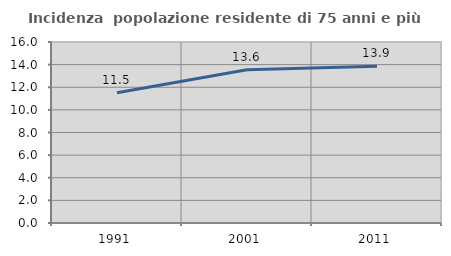
| Category | Incidenza  popolazione residente di 75 anni e più |
|---|---|
| 1991.0 | 11.518 |
| 2001.0 | 13.556 |
| 2011.0 | 13.862 |